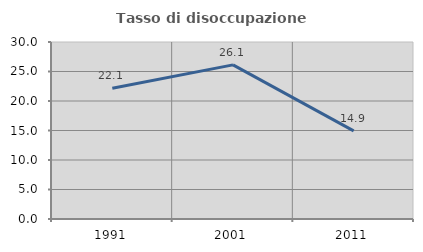
| Category | Tasso di disoccupazione giovanile  |
|---|---|
| 1991.0 | 22.148 |
| 2001.0 | 26.126 |
| 2011.0 | 14.943 |